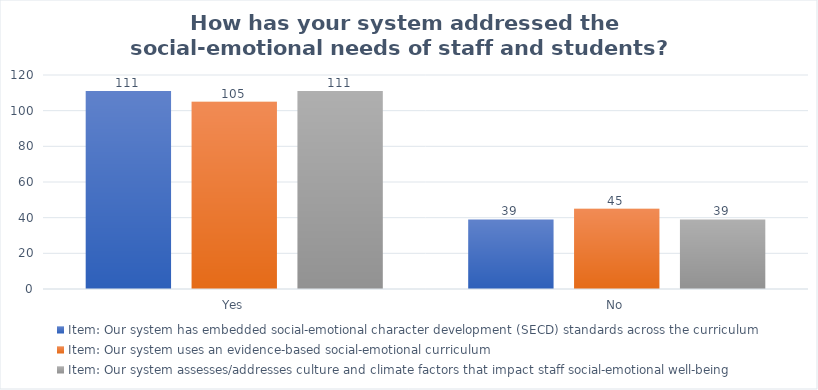
| Category | Item: Our system has embedded social-emotional character development (SECD) standards across the curriculum | Item: Our system uses an evidence-based social-emotional curriculum | Item: Our system assesses/addresses culture and climate factors that impact staff social-emotional well-being |
|---|---|---|---|
| Yes | 111 | 105 | 111 |
| No | 39 | 45 | 39 |